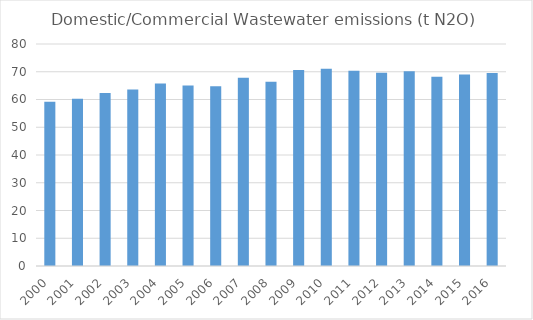
| Category | Series 0 |
|---|---|
| 2000.0 | 59.146 |
| 2001.0 | 60.287 |
| 2002.0 | 62.303 |
| 2003.0 | 63.621 |
| 2004.0 | 65.754 |
| 2005.0 | 65.083 |
| 2006.0 | 64.741 |
| 2007.0 | 67.829 |
| 2008.0 | 66.371 |
| 2009.0 | 70.625 |
| 2010.0 | 71.062 |
| 2011.0 | 70.362 |
| 2012.0 | 69.652 |
| 2013.0 | 70.179 |
| 2014.0 | 68.21 |
| 2015.0 | 69.025 |
| 2016.0 | 69.552 |